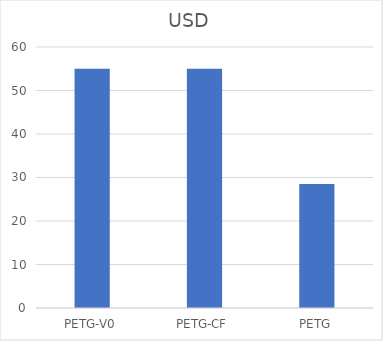
| Category | USD |
|---|---|
| PETG-V0 | 54.99 |
| PETG-CF | 54.99 |
| PETG | 28.5 |